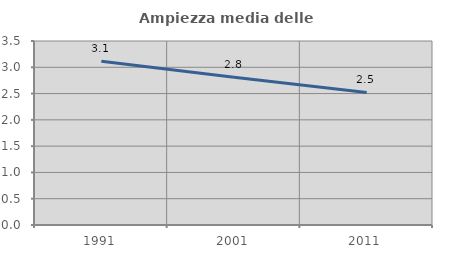
| Category | Ampiezza media delle famiglie |
|---|---|
| 1991.0 | 3.114 |
| 2001.0 | 2.809 |
| 2011.0 | 2.521 |